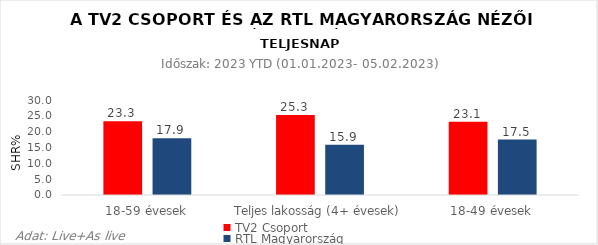
| Category | TV2 Csoport | RTL Magyarország |
|---|---|---|
| 18-59 évesek | 23.3 | 17.9 |
| Teljes lakosság (4+ évesek) | 25.3 | 15.9 |
| 18-49 évesek | 23.1 | 17.5 |